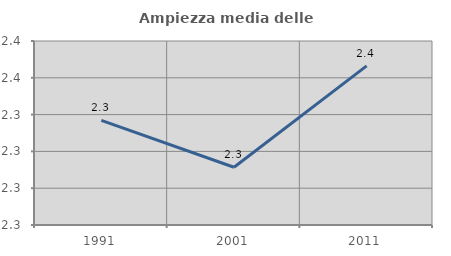
| Category | Ampiezza media delle famiglie |
|---|---|
| 1991.0 | 2.337 |
| 2001.0 | 2.311 |
| 2011.0 | 2.366 |